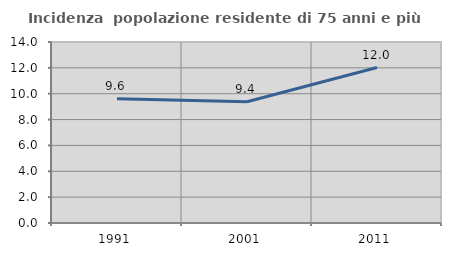
| Category | Incidenza  popolazione residente di 75 anni e più |
|---|---|
| 1991.0 | 9.604 |
| 2001.0 | 9.38 |
| 2011.0 | 12.026 |